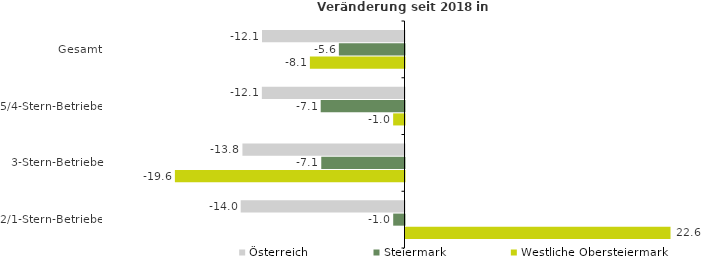
| Category | Österreich | Steiermark | Westliche Obersteiermark |
|---|---|---|---|
| Gesamt | -12.137 | -5.59 | -8.058 |
| 5/4-Stern-Betriebe | -12.15 | -7.138 | -0.967 |
| 3-Stern-Betriebe | -13.805 | -7.09 | -19.558 |
| 2/1-Stern-Betriebe | -13.951 | -0.963 | 22.574 |